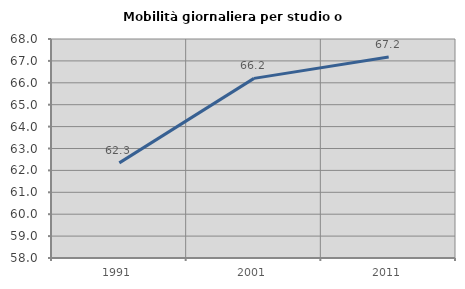
| Category | Mobilità giornaliera per studio o lavoro |
|---|---|
| 1991.0 | 62.344 |
| 2001.0 | 66.202 |
| 2011.0 | 67.18 |